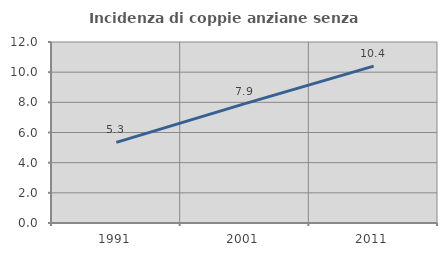
| Category | Incidenza di coppie anziane senza figli  |
|---|---|
| 1991.0 | 5.342 |
| 2001.0 | 7.915 |
| 2011.0 | 10.402 |